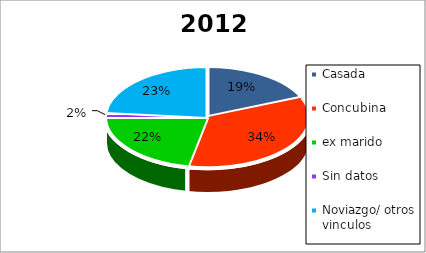
| Category | 2012 |
|---|---|
| Casada | 12 |
| Concubina | 22 |
| ex marido | 14 |
| Sin datos | 1 |
| Noviazgo/ otros vinculos | 15 |